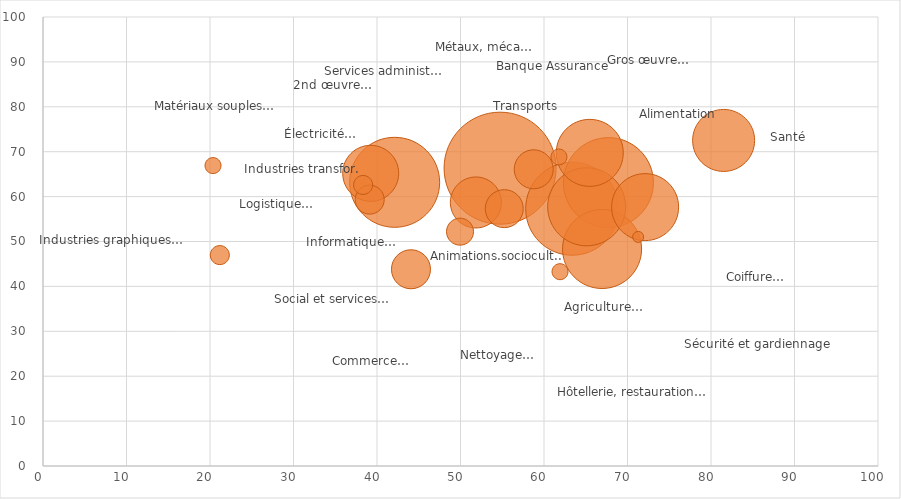
| Category | Taux d'emploi |
|---|---|
| 54.74 | 66.33 |
| 63.37 | 57.31 |
| 67.7 | 63.14 |
| 42.06 | 63.28 |
| 66.9 | 48.43 |
| 65.07 | 57.8 |
| 65.48 | 69.74 |
| 72.11 | 57.66 |
| 81.49 | 72.55 |
| 39.23 | 65.21 |
| 51.8 | 58.77 |
| 44.05 | 43.85 |
| 58.75 | 66.12 |
| 55.19 | 57.41 |
| 39.09 | 59.39 |
| 49.9 | 52.27 |
| 21.15 | 47.02 |
| 38.31 | 62.64 |
| 61.74 | 68.91 |
| 20.31 | 67 |
| 61.87 | 43.37 |
| 71.26 | 51.05 |
| 0.0 | 64.29 |
| 0.0 | 80 |
| 16.67 | 28 |